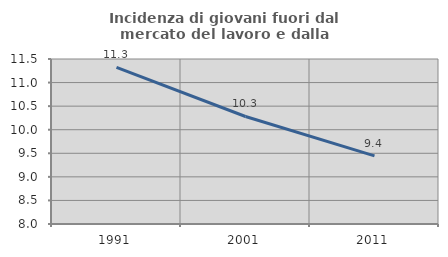
| Category | Incidenza di giovani fuori dal mercato del lavoro e dalla formazione  |
|---|---|
| 1991.0 | 11.322 |
| 2001.0 | 10.281 |
| 2011.0 | 9.446 |